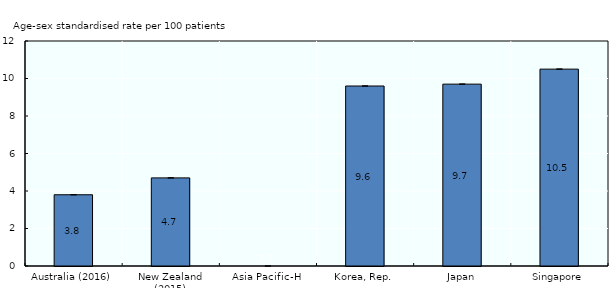
| Category | Age-sex standardised rate  |
|---|---|
| Australia (2016) | 3.8 |
| New Zealand (2015) | 4.7 |
| Asia Pacific-H | 7.66 |
| Korea, Rep. | 9.6 |
| Japan | 9.7 |
| Singapore | 10.5 |